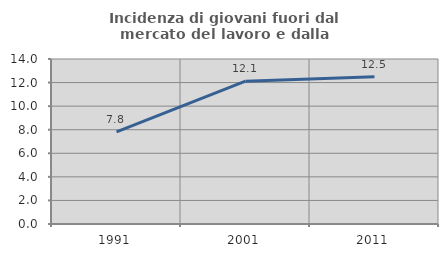
| Category | Incidenza di giovani fuori dal mercato del lavoro e dalla formazione  |
|---|---|
| 1991.0 | 7.812 |
| 2001.0 | 12.121 |
| 2011.0 | 12.5 |